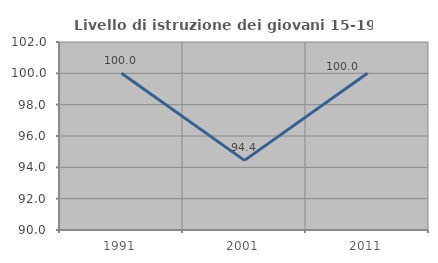
| Category | Livello di istruzione dei giovani 15-19 anni |
|---|---|
| 1991.0 | 100 |
| 2001.0 | 94.444 |
| 2011.0 | 100 |